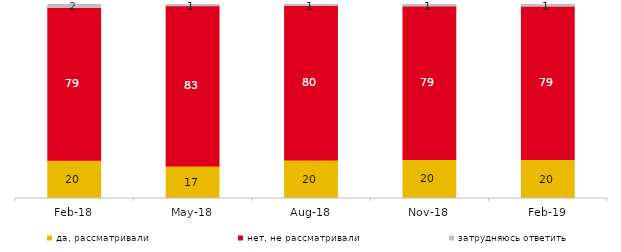
| Category | да, рассматривали | нет, не рассматривали | затрудняюсь ответить |
|---|---|---|---|
| 2018-02-01 | 19.75 | 78.65 | 1.6 |
| 2018-05-01 | 16.7 | 82.65 | 0.65 |
| 2018-08-01 | 19.8 | 79.65 | 0.55 |
| 2018-11-01 | 20.11 | 79.142 | 0.749 |
| 2019-02-01 | 20.1 | 79.05 | 0.85 |